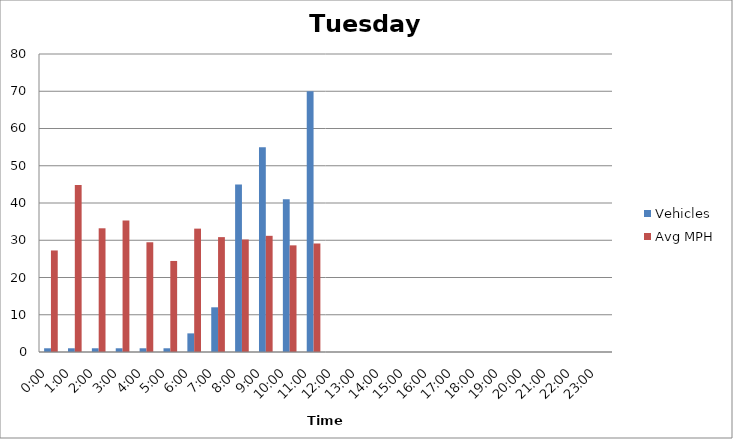
| Category | Vehicles | Avg MPH |
|---|---|---|
| 0:00 | 1 | 27.26 |
| 1:00 | 1 | 44.81 |
| 2:00 | 1 | 33.21 |
| 3:00 | 1 | 35.28 |
| 4:00 | 1 | 29.46 |
| 5:00 | 1 | 24.44 |
| 6:00 | 5 | 33.12 |
| 7:00 | 12 | 30.84 |
| 8:00 | 45 | 30.2 |
| 9:00 | 55 | 31.19 |
| 10:00 | 41 | 28.63 |
| 11:00 | 70 | 29.13 |
| 12:00 | 0 | 0 |
| 13:00 | 0 | 0 |
| 14:00 | 0 | 0 |
| 15:00 | 0 | 0 |
| 16:00 | 0 | 0 |
| 17:00 | 0 | 0 |
| 18:00 | 0 | 0 |
| 19:00 | 0 | 0 |
| 20:00 | 0 | 0 |
| 21:00 | 0 | 0 |
| 22:00 | 0 | 0 |
| 23:00 | 0 | 0 |